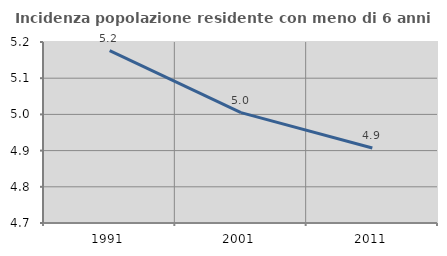
| Category | Incidenza popolazione residente con meno di 6 anni |
|---|---|
| 1991.0 | 5.176 |
| 2001.0 | 5.005 |
| 2011.0 | 4.907 |